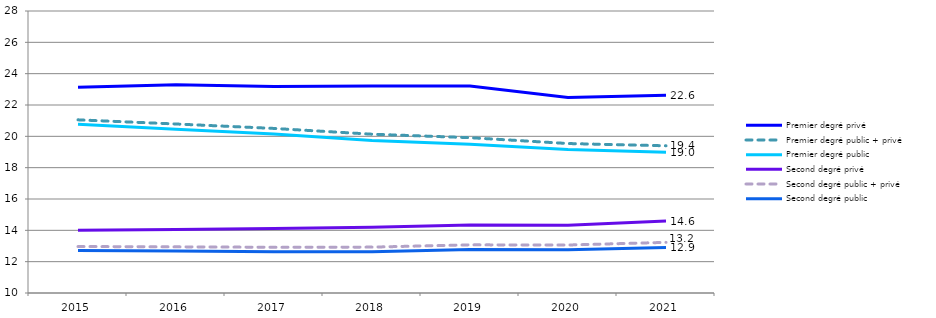
| Category | Premier degré privé | Premier degré public + privé | Premier degré public | Second degré privé | Second degré public + privé | Second degré public |
|---|---|---|---|---|---|---|
| 2015.0 | 23.129 | 21.053 | 20.77 | 14.008 | 12.967 | 12.72 |
| 2016.0 | 23.296 | 20.788 | 20.451 | 14.047 | 12.946 | 12.685 |
| 2017.0 | 23.188 | 20.504 | 20.145 | 14.119 | 12.919 | 12.637 |
| 2018.0 | 23.218 | 20.136 | 19.731 | 14.194 | 12.929 | 12.633 |
| 2019.0 | 23.209 | 19.915 | 19.488 | 14.34 | 13.074 | 12.776 |
| 2020.0 | 22.48 | 19.541 | 19.156 | 14.327 | 13.063 | 12.765 |
| 2021.0 | 22.628 | 19.395 | 18.976 | 14.589 | 13.232 | 12.912 |